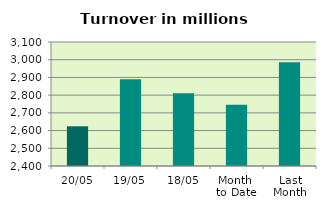
| Category | Series 0 |
|---|---|
| 20/05 | 2623.992 |
| 19/05 | 2890.051 |
| 18/05 | 2811.071 |
| Month 
to Date | 2745.566 |
| Last
Month | 2985.476 |